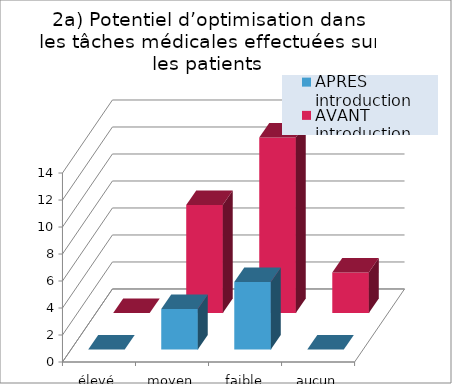
| Category | APRÈS introduction | AVANT introduction |
|---|---|---|
| élevé | 0 | 0 |
| moyen | 3 | 8 |
| faible | 5 | 13 |
| aucun | 0 | 3 |